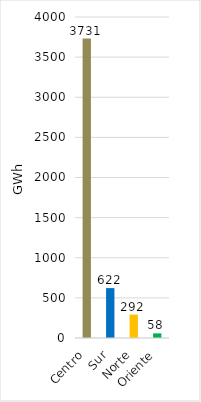
| Category | Series 0 |
|---|---|
| Centro | 3730.741 |
| Sur | 621.683 |
| Norte | 291.762 |
| Oriente | 57.668 |